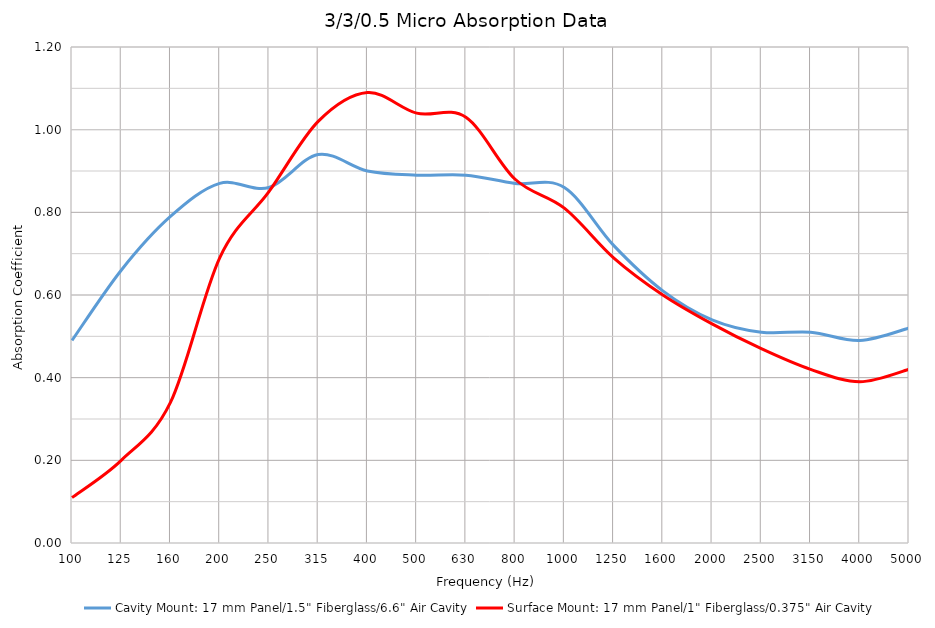
| Category | Cavity Mount: 17 mm Panel/1.5" Fiberglass/6.6" Air Cavity | Surface Mount: 17 mm Panel/1" Fiberglass/0.375" Air Cavity |
|---|---|---|
| 100.0 | 0.49 | 0.11 |
| 125.0 | 0.66 | 0.2 |
| 160.0 | 0.79 | 0.34 |
| 200.0 | 0.87 | 0.69 |
| 250.0 | 0.86 | 0.85 |
| 315.0 | 0.94 | 1.02 |
| 400.0 | 0.9 | 1.09 |
| 500.0 | 0.89 | 1.04 |
| 630.0 | 0.89 | 1.03 |
| 800.0 | 0.87 | 0.88 |
| 1000.0 | 0.86 | 0.81 |
| 1250.0 | 0.72 | 0.69 |
| 1600.0 | 0.61 | 0.6 |
| 2000.0 | 0.54 | 0.53 |
| 2500.0 | 0.51 | 0.47 |
| 3150.0 | 0.51 | 0.42 |
| 4000.0 | 0.49 | 0.39 |
| 5000.0 | 0.52 | 0.42 |